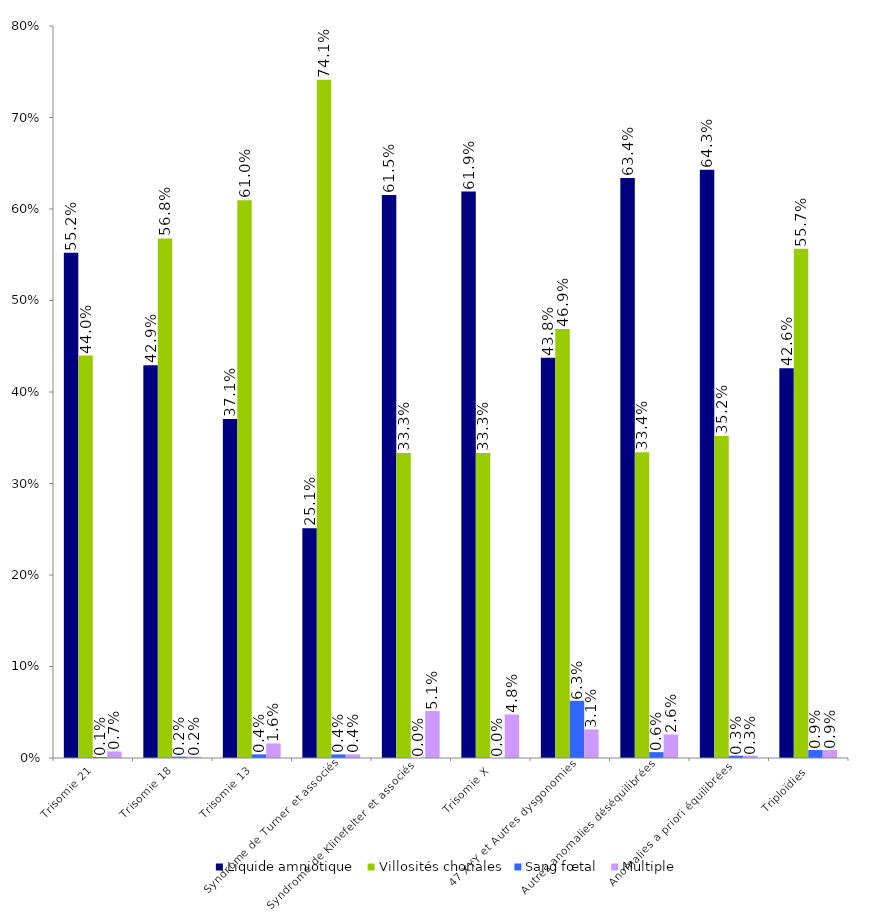
| Category | Liquide amniotique | Villosités choriales | Sang fœtal | Multiple |
|---|---|---|---|---|
| Trisomie 21 | 0.552 | 0.44 | 0.001 | 0.007 |
| Trisomie 18 | 0.429 | 0.568 | 0.002 | 0.002 |
| Trisomie 13 | 0.371 | 0.61 | 0.004 | 0.016 |
| Syndrome de Turner et associés | 0.251 | 0.741 | 0.004 | 0.004 |
| Syndrome de Klinefelter et associés | 0.615 | 0.333 | 0 | 0.051 |
| Trisomie X | 0.619 | 0.333 | 0 | 0.048 |
| 47 XYY et Autres dysgonomies | 0.438 | 0.469 | 0.062 | 0.031 |
| Autres anomalies déséquilibrées | 0.634 | 0.334 | 0.006 | 0.026 |
| Anomalies a priori équilibrées | 0.643 | 0.352 | 0.003 | 0.003 |
| Triploïdies | 0.426 | 0.557 | 0.009 | 0.009 |